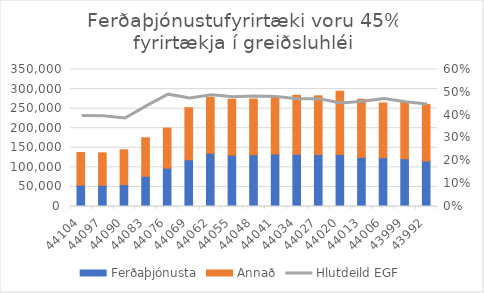
| Category | Ferðaþjónusta | Annað |
|---|---|---|
| 44104.0 | 54596 | 83313 |
| 44097.0 | 54128 | 82862 |
| 44090.0 | 55866 | 89084 |
| 44083.0 | 77223 | 98426 |
| 44076.0 | 98076 | 102178 |
| 44069.0 | 119462 | 132820 |
| 44062.0 | 135974 | 143183 |
| 44055.0 | 131116 | 142934 |
| 44048.0 | 132292 | 142428 |
| 44041.0 | 134036 | 145257 |
| 44034.0 | 133557 | 150685 |
| 44027.0 | 132747 | 149969 |
| 44020.0 | 132926 | 161699 |
| 44013.0 | 125663 | 148263 |
| 44006.0 | 124619 | 139914 |
| 43999.0 | 122059 | 145297 |
| 43992.0 | 116331 | 144097 |